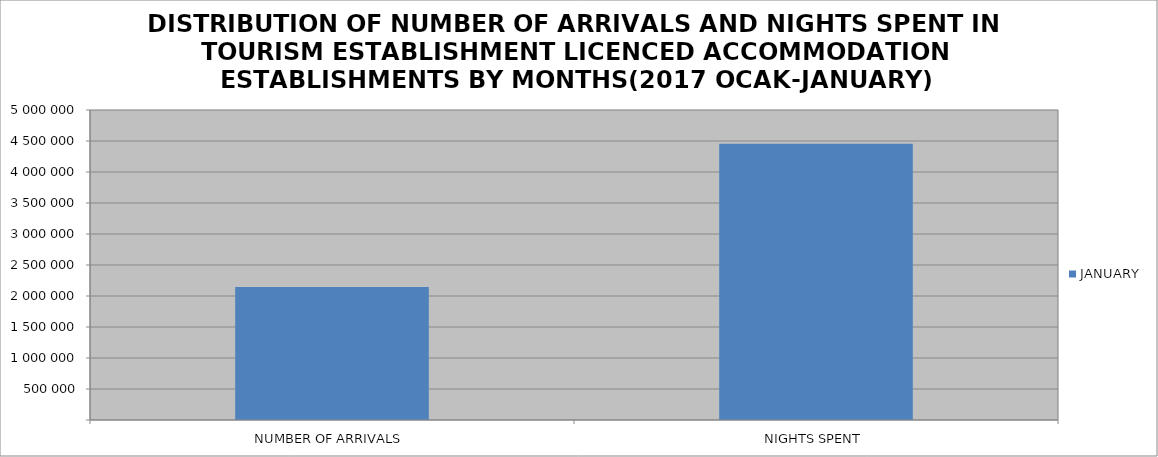
| Category | JANUARY |
|---|---|
| NUMBER OF ARRIVALS | 2146994 |
| NIGHTS SPENT | 4457352 |